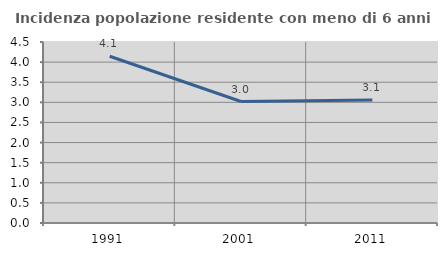
| Category | Incidenza popolazione residente con meno di 6 anni |
|---|---|
| 1991.0 | 4.146 |
| 2001.0 | 3.02 |
| 2011.0 | 3.059 |